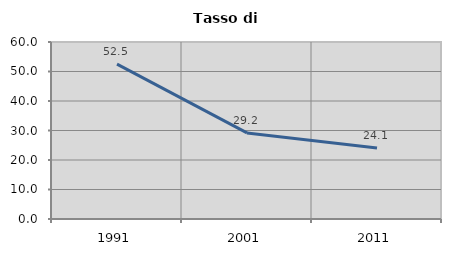
| Category | Tasso di disoccupazione   |
|---|---|
| 1991.0 | 52.522 |
| 2001.0 | 29.172 |
| 2011.0 | 24.065 |